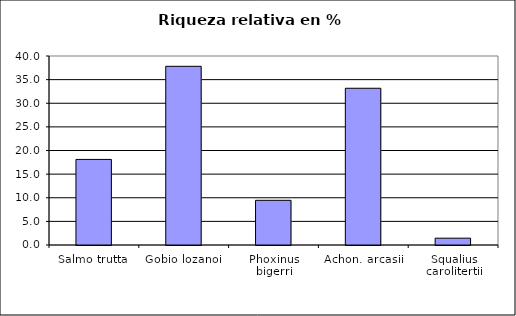
| Category | Series 0 |
|---|---|
| Salmo trutta | 18.109 |
| Gobio lozanoi | 37.821 |
| Phoxinus bigerri | 9.455 |
| Achon. arcasii | 33.173 |
| Squalius carolitertii | 1.442 |